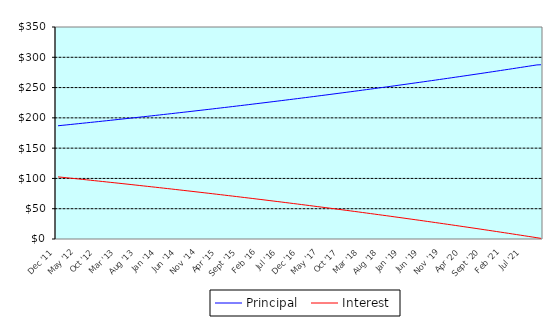
| Category | Principal | Interest |
|---|---|---|
| 0 | 186.95 | 102.55 |
| 1900-01-01 | 187.63 | 101.87 |
| 1900-01-02 | 188.31 | 101.19 |
| 1900-01-03 | 189 | 100.5 |
| 1900-01-04 | 189.69 | 99.81 |
| 1900-01-05 | 190.38 | 99.12 |
| 1900-01-06 | 191.08 | 98.42 |
| 1900-01-07 | 191.78 | 97.72 |
| 1900-01-08 | 192.48 | 97.02 |
| 1900-01-09 | 193.18 | 96.32 |
| 1900-01-10 | 193.88 | 95.62 |
| 1900-01-11 | 194.59 | 94.91 |
| 1900-01-12 | 195.3 | 94.2 |
| 1900-01-13 | 196.02 | 93.48 |
| 1900-01-14 | 196.73 | 92.77 |
| 1900-01-15 | 197.45 | 92.05 |
| 1900-01-16 | 198.17 | 91.33 |
| 1900-01-17 | 198.89 | 90.61 |
| 1900-01-18 | 199.62 | 89.88 |
| 1900-01-19 | 200.35 | 89.15 |
| 1900-01-20 | 201.08 | 88.42 |
| 1900-01-21 | 201.82 | 87.68 |
| 1900-01-22 | 202.55 | 86.95 |
| 1900-01-23 | 203.29 | 86.21 |
| 1900-01-24 | 204.03 | 85.47 |
| 1900-01-25 | 204.78 | 84.72 |
| 1900-01-26 | 205.53 | 83.97 |
| 1900-01-27 | 206.28 | 83.22 |
| 1900-01-28 | 207.03 | 82.47 |
| 1900-01-29 | 207.79 | 81.71 |
| 1900-01-30 | 208.54 | 80.96 |
| 1900-01-31 | 209.31 | 80.19 |
| 1900-02-01 | 210.07 | 79.43 |
| 1900-02-02 | 210.84 | 78.66 |
| 1900-02-03 | 211.61 | 77.89 |
| 1900-02-04 | 212.38 | 77.12 |
| 1900-02-05 | 213.16 | 76.34 |
| 1900-02-06 | 213.93 | 75.57 |
| 1900-02-07 | 214.71 | 74.79 |
| 1900-02-08 | 215.5 | 74 |
| 1900-02-09 | 216.29 | 73.21 |
| 1900-02-10 | 217.08 | 72.42 |
| 1900-02-11 | 217.87 | 71.63 |
| 1900-02-12 | 218.66 | 70.84 |
| 1900-02-13 | 219.46 | 70.04 |
| 1900-02-14 | 220.26 | 69.24 |
| 1900-02-15 | 221.07 | 68.43 |
| 1900-02-16 | 221.87 | 67.63 |
| 1900-02-17 | 222.68 | 66.82 |
| 1900-02-18 | 223.5 | 66 |
| 1900-02-19 | 224.31 | 65.19 |
| 1900-02-20 | 225.13 | 64.37 |
| 1900-02-21 | 225.95 | 63.55 |
| 1900-02-22 | 226.78 | 62.72 |
| 1900-02-23 | 227.61 | 61.89 |
| 1900-02-24 | 228.44 | 61.06 |
| 1900-02-25 | 229.27 | 60.23 |
| 1900-02-26 | 230.11 | 59.39 |
| 1900-02-27 | 230.95 | 58.55 |
| 1900-02-28 | 231.79 | 57.71 |
| 1900-02-28 | 232.64 | 56.86 |
| 1900-03-01 | 233.49 | 56.01 |
| 1900-03-02 | 234.34 | 55.16 |
| 1900-03-03 | 235.2 | 54.3 |
| 1900-03-04 | 236.06 | 53.44 |
| 1900-03-05 | 236.92 | 52.58 |
| 1900-03-06 | 237.78 | 51.72 |
| 1900-03-07 | 238.65 | 50.85 |
| 1900-03-08 | 239.52 | 49.98 |
| 1900-03-09 | 240.4 | 49.1 |
| 1900-03-10 | 241.27 | 48.23 |
| 1900-03-11 | 242.16 | 47.34 |
| 1900-03-12 | 243.04 | 46.46 |
| 1900-03-13 | 243.93 | 45.57 |
| 1900-03-14 | 244.82 | 44.68 |
| 1900-03-15 | 245.71 | 43.79 |
| 1900-03-16 | 246.61 | 42.89 |
| 1900-03-17 | 247.51 | 41.99 |
| 1900-03-18 | 248.41 | 41.09 |
| 1900-03-19 | 249.32 | 40.18 |
| 1900-03-20 | 250.23 | 39.27 |
| 1900-03-21 | 251.14 | 38.36 |
| 1900-03-22 | 252.06 | 37.44 |
| 1900-03-23 | 252.98 | 36.52 |
| 1900-03-24 | 253.91 | 35.59 |
| 1900-03-25 | 254.83 | 34.67 |
| 1900-03-26 | 255.76 | 33.74 |
| 1900-03-27 | 256.7 | 32.8 |
| 1900-03-28 | 257.63 | 31.87 |
| 1900-03-29 | 258.57 | 30.93 |
| 1900-03-30 | 259.52 | 29.98 |
| 1900-03-31 | 260.47 | 29.03 |
| 1900-04-01 | 261.42 | 28.08 |
| 1900-04-02 | 262.37 | 27.13 |
| 1900-04-03 | 263.33 | 26.17 |
| 1900-04-04 | 264.29 | 25.21 |
| 1900-04-05 | 265.26 | 24.24 |
| 1900-04-06 | 266.22 | 23.28 |
| 1900-04-07 | 267.2 | 22.3 |
| 1900-04-08 | 268.17 | 21.33 |
| 1900-04-09 | 269.15 | 20.35 |
| 1900-04-10 | 270.13 | 19.37 |
| 1900-04-11 | 271.12 | 18.38 |
| 1900-04-12 | 272.11 | 17.39 |
| 1900-04-13 | 273.1 | 16.4 |
| 1900-04-14 | 274.1 | 15.4 |
| 1900-04-15 | 275.1 | 14.4 |
| 1900-04-16 | 276.11 | 13.39 |
| 1900-04-17 | 277.11 | 12.39 |
| 1900-04-18 | 278.13 | 11.37 |
| 1900-04-19 | 279.14 | 10.36 |
| 1900-04-20 | 280.16 | 9.34 |
| 1900-04-21 | 281.18 | 8.32 |
| 1900-04-22 | 282.21 | 7.29 |
| 1900-04-23 | 283.24 | 6.26 |
| 1900-04-24 | 284.28 | 5.22 |
| 1900-04-25 | 285.31 | 4.19 |
| 1900-04-26 | 286.35 | 3.15 |
| 1900-04-27 | 287.4 | 2.1 |
| 1900-04-28 | 287.66 | 1.05 |